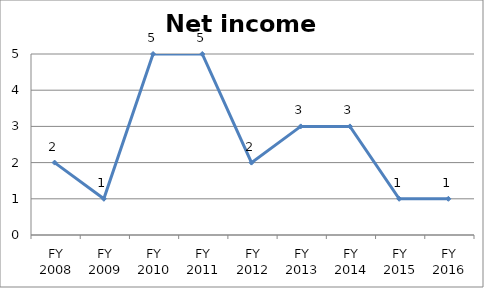
| Category | Net income score |
|---|---|
| FY 2016 | 1 |
| FY 2015 | 1 |
| FY 2014 | 3 |
| FY 2013 | 3 |
| FY 2012 | 2 |
| FY 2011 | 5 |
| FY 2010 | 5 |
| FY 2009 | 1 |
| FY 2008 | 2 |